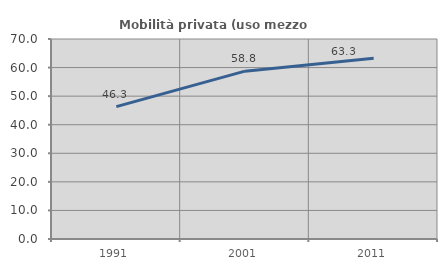
| Category | Mobilità privata (uso mezzo privato) |
|---|---|
| 1991.0 | 46.318 |
| 2001.0 | 58.75 |
| 2011.0 | 63.301 |